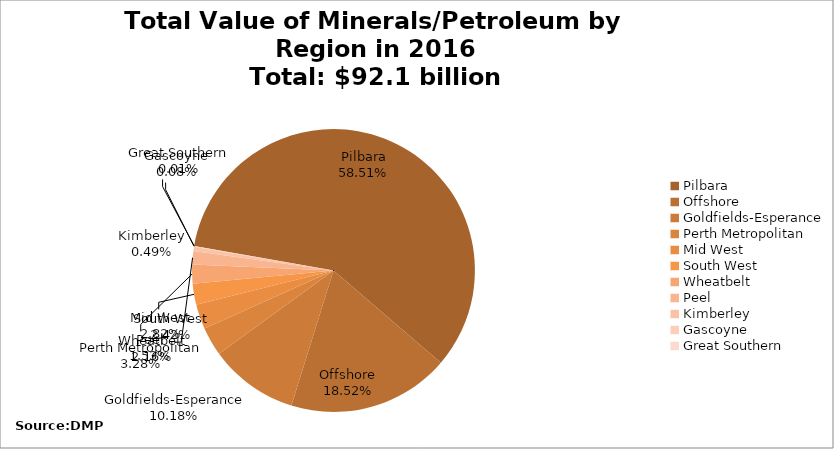
| Category | Value of Minerals and Petroleum in WA by Region |
|---|---|
| Pilbara | 53866329971.104 |
| Offshore | 17053777534.26 |
| Goldfields-Esperance | 9376344222.189 |
| Perth Metropolitan | 3020861725.148 |
| Mid West | 2592943901.016 |
| South West | 2228488283.126 |
| Wheatbelt | 1990133600.364 |
| Peel | 1405587585 |
| Kimberley | 451736557.428 |
| Gascoyne | 69329254.33 |
| Great Southern | 6667240 |